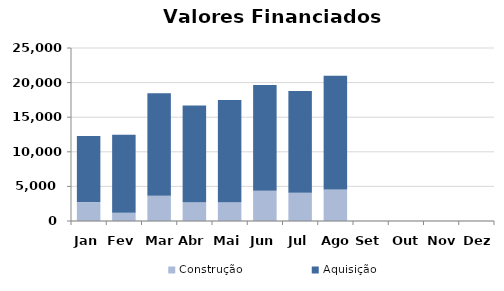
| Category | Construção | Aquisição  |
|---|---|---|
| Jan | 2736.443 | 9550.699 |
| Fev | 1204.78 | 11256.207 |
| Mar | 3647.063 | 14822.155 |
| Abr | 2716.578 | 13979.194 |
| Mai | 2722.144 | 14749.532 |
| Jun | 4362.743 | 15299.263 |
| Jul | 4090.415 | 14697.274 |
| Ago | 4569.17 | 16437.447 |
| Set | 0 | 0 |
| Out | 0 | 0 |
| Nov | 0 | 0 |
| Dez | 0 | 0 |